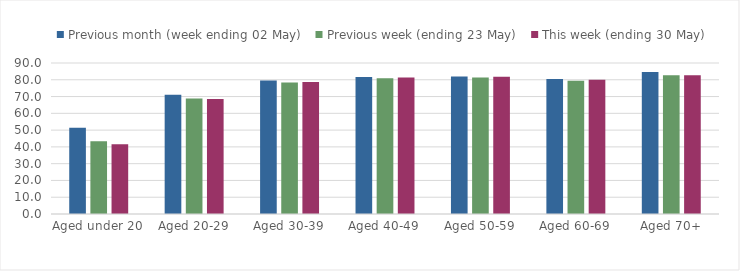
| Category | Previous month (week ending 02 May) | Previous week (ending 23 May) | This week (ending 30 May) |
|---|---|---|---|
| Aged under 20 | 51.473 | 43.424 | 41.576 |
| Aged 20-29 | 71.096 | 68.802 | 68.559 |
| Aged 30-39 | 79.588 | 78.336 | 78.65 |
| Aged 40-49 | 81.598 | 80.976 | 81.4 |
| Aged 50-59 | 81.98 | 81.353 | 81.873 |
| Aged 60-69 | 80.5 | 79.424 | 80.026 |
| Aged 70+ | 84.692 | 82.75 | 82.673 |